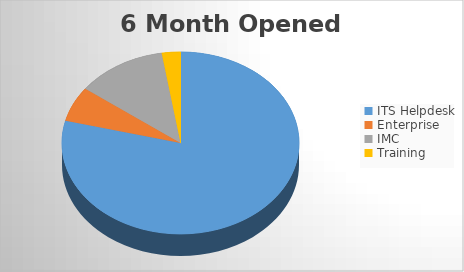
| Category | 6M Opened |
|---|---|
| ITS Helpdesk | 1521 |
| Enterprise | 120 |
| IMC | 237 |
| Training | 49 |